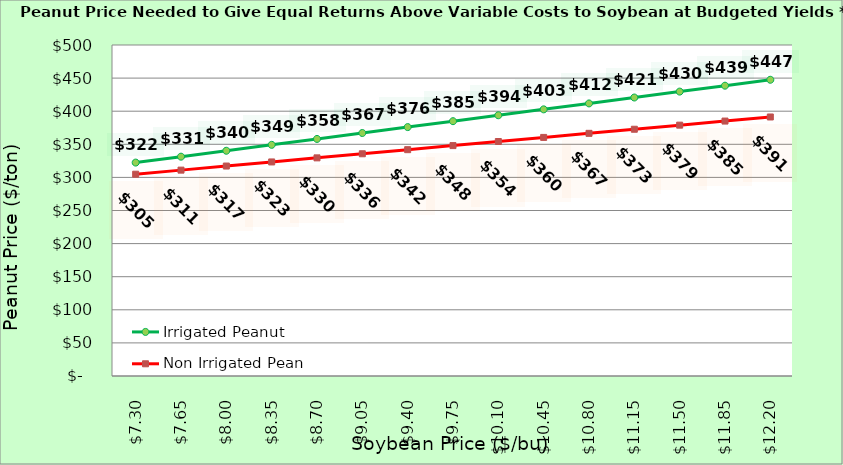
| Category | Irrigated Peanut | Non Irrigated Peanut |
|---|---|---|
| 7.3000000000000025 | 322.377 | 304.808 |
| 7.650000000000002 | 331.313 | 310.984 |
| 8.000000000000002 | 340.249 | 317.16 |
| 8.350000000000001 | 349.185 | 323.337 |
| 8.700000000000001 | 358.121 | 329.513 |
| 9.05 | 367.057 | 335.69 |
| 9.4 | 375.994 | 341.866 |
| 9.75 | 384.93 | 348.043 |
| 10.1 | 393.866 | 354.219 |
| 10.45 | 402.802 | 360.396 |
| 10.799999999999999 | 411.738 | 366.572 |
| 11.149999999999999 | 420.674 | 372.749 |
| 11.499999999999998 | 429.611 | 378.925 |
| 11.849999999999998 | 438.547 | 385.102 |
| 12.199999999999998 | 447.483 | 391.278 |